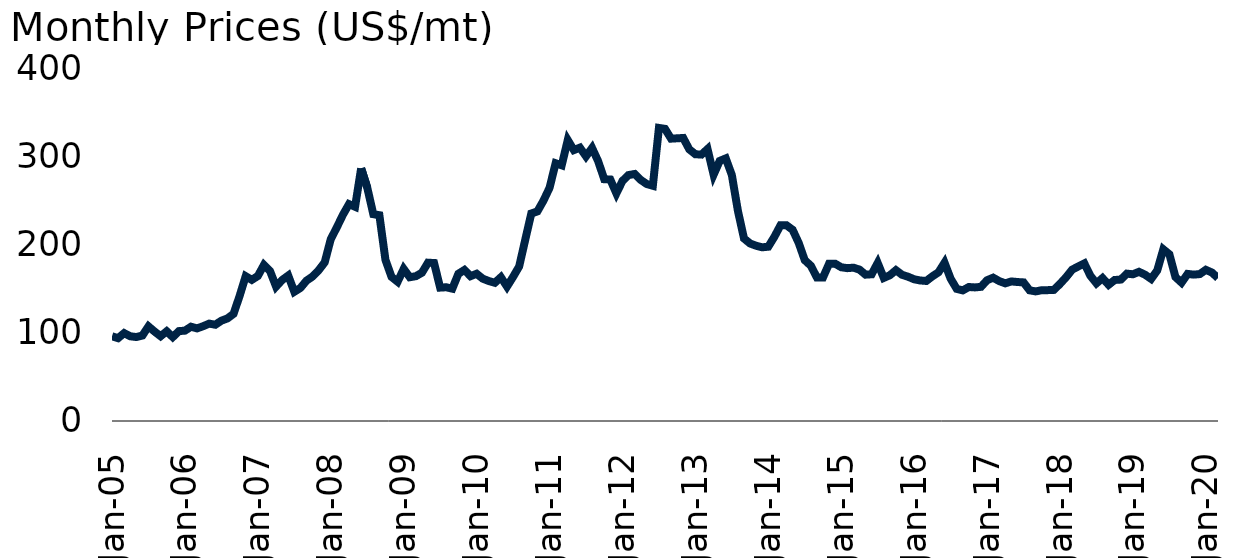
| Category | Maize |
|---|---|
| 2005-01-01 | 96.255 |
| 2005-02-01 | 94.139 |
| 2005-03-01 | 99.877 |
| 2005-04-01 | 96.279 |
| 2005-05-01 | 95.418 |
| 2005-06-01 | 97.101 |
| 2005-07-01 | 107.524 |
| 2005-08-01 | 101.668 |
| 2005-09-01 | 96.353 |
| 2005-10-01 | 101.939 |
| 2005-11-01 | 95.369 |
| 2005-12-01 | 102.14 |
| 2006-01-01 | 102.652 |
| 2006-02-01 | 107.13 |
| 2006-03-01 | 105.25 |
| 2006-04-01 | 107.721 |
| 2006-05-01 | 110.649 |
| 2006-06-01 | 109.404 |
| 2006-07-01 | 113.991 |
| 2006-08-01 | 116.588 |
| 2006-09-01 | 121.746 |
| 2006-10-01 | 142.168 |
| 2006-11-01 | 164.539 |
| 2006-12-01 | 160.375 |
| 2007-01-01 | 164.775 |
| 2007-02-01 | 177.349 |
| 2007-03-01 | 170.507 |
| 2007-04-01 | 152.748 |
| 2007-05-01 | 160.228 |
| 2007-06-01 | 165.247 |
| 2007-07-01 | 146.843 |
| 2007-08-01 | 151.173 |
| 2007-09-01 | 159.44 |
| 2007-10-01 | 164.165 |
| 2007-11-01 | 171.251 |
| 2007-12-01 | 180.254 |
| 2008-01-01 | 206.662 |
| 2008-02-01 | 220.067 |
| 2008-03-01 | 234.358 |
| 2008-04-01 | 246.444 |
| 2008-05-01 | 243.456 |
| 2008-06-01 | 287.111 |
| 2008-07-01 | 265.34 |
| 2008-08-01 | 235.027 |
| 2008-09-01 | 233.846 |
| 2008-10-01 | 183.061 |
| 2008-11-01 | 163.771 |
| 2008-12-01 | 158.259 |
| 2009-01-01 | 172.826 |
| 2009-02-01 | 163.377 |
| 2009-03-01 | 164.558 |
| 2009-04-01 | 168.495 |
| 2009-05-01 | 179.912 |
| 2009-06-01 | 179.518 |
| 2009-07-01 | 151.567 |
| 2009-08-01 | 151.96 |
| 2009-09-01 | 150.386 |
| 2009-10-01 | 167.314 |
| 2009-11-01 | 171.644 |
| 2009-12-01 | 164.558 |
| 2010-01-01 | 167.314 |
| 2010-02-01 | 161.802 |
| 2010-03-01 | 159.047 |
| 2010-04-01 | 157.078 |
| 2010-05-01 | 163.377 |
| 2010-06-01 | 152.748 |
| 2010-07-01 | 163.757 |
| 2010-08-01 | 175.581 |
| 2010-09-01 | 205.895 |
| 2010-10-01 | 235.814 |
| 2010-11-01 | 238.176 |
| 2010-12-01 | 250.38 |
| 2011-01-01 | 264.947 |
| 2011-02-01 | 292.898 |
| 2011-03-01 | 290.536 |
| 2011-04-01 | 319.274 |
| 2011-05-01 | 307.858 |
| 2011-06-01 | 310.614 |
| 2011-07-01 | 300.772 |
| 2011-08-01 | 310.22 |
| 2011-09-01 | 295.26 |
| 2011-10-01 | 274.789 |
| 2011-11-01 | 274.395 |
| 2011-12-01 | 258.648 |
| 2012-01-01 | 272.845 |
| 2012-02-01 | 279.459 |
| 2012-03-01 | 280.694 |
| 2012-04-01 | 274.001 |
| 2012-05-01 | 269.277 |
| 2012-06-01 | 267.309 |
| 2012-07-01 | 333.053 |
| 2012-08-01 | 331.992 |
| 2012-09-01 | 320.849 |
| 2012-10-01 | 321.243 |
| 2012-11-01 | 321.637 |
| 2012-12-01 | 308.645 |
| 2013-01-01 | 303.134 |
| 2013-02-01 | 302.74 |
| 2013-03-01 | 309.039 |
| 2013-04-01 | 279.906 |
| 2013-05-01 | 295.538 |
| 2013-06-01 | 298.409 |
| 2013-07-01 | 279.513 |
| 2013-08-01 | 238.736 |
| 2013-09-01 | 207.405 |
| 2013-10-01 | 201.725 |
| 2013-11-01 | 199.135 |
| 2013-12-01 | 197.391 |
| 2014-01-01 | 198.064 |
| 2014-02-01 | 209.324 |
| 2014-03-01 | 222.331 |
| 2014-04-01 | 222.358 |
| 2014-05-01 | 217.296 |
| 2014-06-01 | 202.395 |
| 2014-07-01 | 182.727 |
| 2014-08-01 | 176.424 |
| 2014-09-01 | 163.058 |
| 2014-10-01 | 163.121 |
| 2014-11-01 | 178.743 |
| 2014-12-01 | 178.735 |
| 2015-01-01 | 174.707 |
| 2015-02-01 | 173.696 |
| 2015-03-01 | 174.227 |
| 2015-04-01 | 172.054 |
| 2015-05-01 | 166.294 |
| 2015-06-01 | 166.72 |
| 2015-07-01 | 179.597 |
| 2015-08-01 | 162.594 |
| 2015-09-01 | 165.621 |
| 2015-10-01 | 171.389 |
| 2015-11-01 | 166.157 |
| 2015-12-01 | 163.948 |
| 2016-01-01 | 161.027 |
| 2016-02-01 | 159.677 |
| 2016-03-01 | 159.137 |
| 2016-04-01 | 164.413 |
| 2016-05-01 | 168.956 |
| 2016-06-01 | 179.872 |
| 2016-07-01 | 161.759 |
| 2016-08-01 | 150.153 |
| 2016-09-01 | 148.425 |
| 2016-10-01 | 152.26 |
| 2016-11-01 | 151.803 |
| 2016-12-01 | 152.449 |
| 2017-01-01 | 159.988 |
| 2017-02-01 | 162.858 |
| 2017-03-01 | 158.964 |
| 2017-04-01 | 156.441 |
| 2017-05-01 | 158.59 |
| 2017-06-01 | 157.933 |
| 2017-07-01 | 157.511 |
| 2017-08-01 | 148.496 |
| 2017-09-01 | 147.291 |
| 2017-10-01 | 148.622 |
| 2017-11-01 | 148.705 |
| 2017-12-01 | 148.98 |
| 2018-01-01 | 155.838 |
| 2018-02-01 | 163.358 |
| 2018-03-01 | 171.999 |
| 2018-04-01 | 175.605 |
| 2018-05-01 | 179.085 |
| 2018-06-01 | 165.07 |
| 2018-07-01 | 156.46 |
| 2018-08-01 | 162.373 |
| 2018-09-01 | 154.803 |
| 2018-10-01 | 160.255 |
| 2018-11-01 | 160.688 |
| 2018-12-01 | 167.44 |
| 2019-01-01 | 166.743 |
| 2019-02-01 | 169.523 |
| 2019-03-01 | 166.224 |
| 2019-04-01 | 161.488 |
| 2019-05-01 | 171.082 |
| 2019-06-01 | 195.08 |
| 2019-07-01 | 189.419 |
| 2019-08-01 | 163.586 |
| 2019-09-01 | 157.259 |
| 2019-10-01 | 167.149 |
| 2019-11-01 | 166.334 |
| 2019-12-01 | 166.956 |
| 2020-01-01 | 171.786 |
| 2020-02-01 | 168.712 |
| 2020-03-01 | 162.421 |